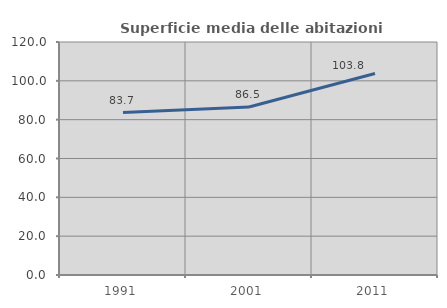
| Category | Superficie media delle abitazioni occupate |
|---|---|
| 1991.0 | 83.677 |
| 2001.0 | 86.526 |
| 2011.0 | 103.794 |